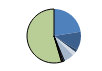
| Category | Series 0 |
|---|---|
| ARRASTRE | 283 |
| CERCO | 142 |
| ATUNEROS CAÑEROS | 19 |
| PALANGRE DE FONDO | 29 |
| PALANGRE DE SUPERFICIE | 70 |
| RASCO | 8 |
| VOLANTA | 11 |
| ARTES FIJAS | 11 |
| ARTES MENORES | 688 |